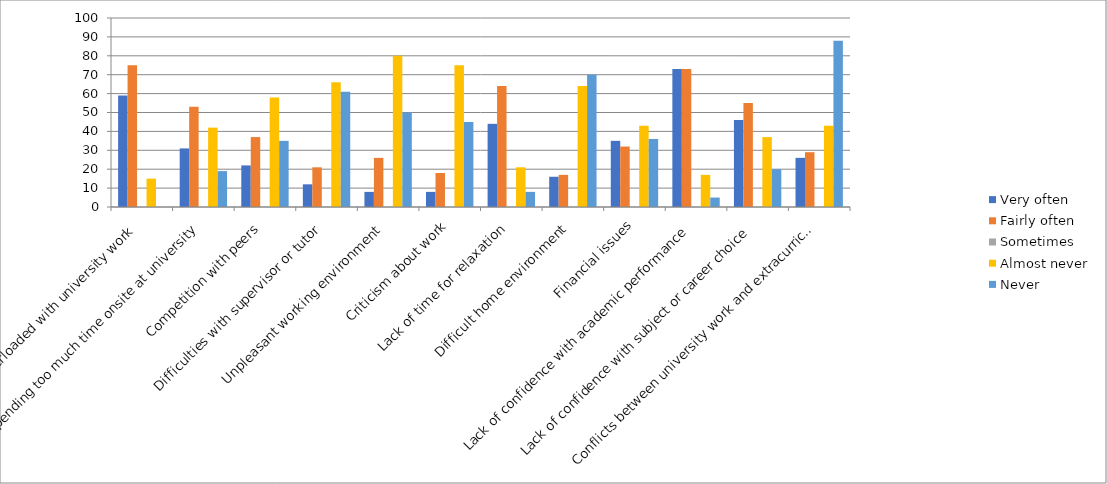
| Category | Very often | Fairly often | Sometimes | Almost never | Never |
|---|---|---|---|---|---|
| Feeling overloaded with university work | 59 | 75 | 0 | 15 | 0 |
| Spending too much time onsite at university | 31 | 53 | 0 | 42 | 19 |
| Competition with peers | 22 | 37 | 0 | 58 | 35 |
| Difficulties with supervisor or tutor | 12 | 21 | 0 | 66 | 61 |
| Unpleasant working environment | 8 | 26 | 0 | 80 | 50 |
| Criticism about work | 8 | 18 | 0 | 75 | 45 |
| Lack of time for relaxation | 44 | 64 | 0 | 21 | 8 |
| Difficult home environment | 16 | 17 | 0 | 64 | 70 |
| Financial issues | 35 | 32 | 0 | 43 | 36 |
| Lack of confidence with academic performance | 73 | 73 | 0 | 17 | 5 |
| Lack of confidence with subject or career choice | 46 | 55 | 0 | 37 | 20 |
| Conflicts between university work and extracurricular employment | 26 | 29 | 0 | 43 | 88 |